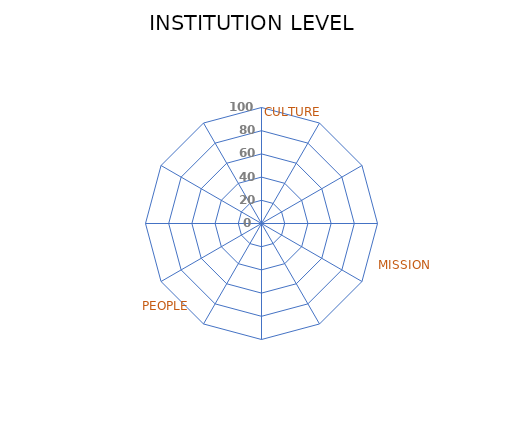
| Category | Series 0 |
|---|---|
| GOVERNANCE | 0 |
| STRATEGY | 0 |
| INCLUSIVE CONTEXT | 0 |
| MEASUREMENT | 0 |
| CURRICULA | 0 |
| RESEARCH | 0 |
| OUTREACH | 0 |
| FUNDING | 0 |
| IDENTIFICATION | 0 |
| CONSULTATION | 0 |
| INVOLVEMENT | 0 |
| CO-CREATION | 0 |